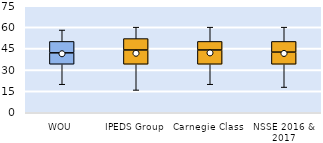
| Category | 25th | 50th | 75th |
|---|---|---|---|
| WOU | 34 | 8 | 8 |
| IPEDS Group | 34 | 10 | 8 |
| Carnegie Class | 34 | 10 | 6 |
| NSSE 2016 & 2017 | 34 | 8.5 | 7.5 |